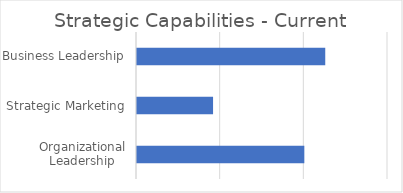
| Category | Current |
|---|---|
| Organizational Leadership | 1 |
| Strategic Marketing | 0.455 |
| Business Leadership | 1.125 |